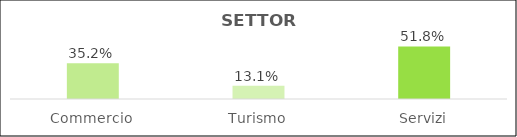
| Category | Series 0 |
|---|---|
| Commercio | 0.352 |
| Turismo | 0.131 |
| Servizi | 0.518 |